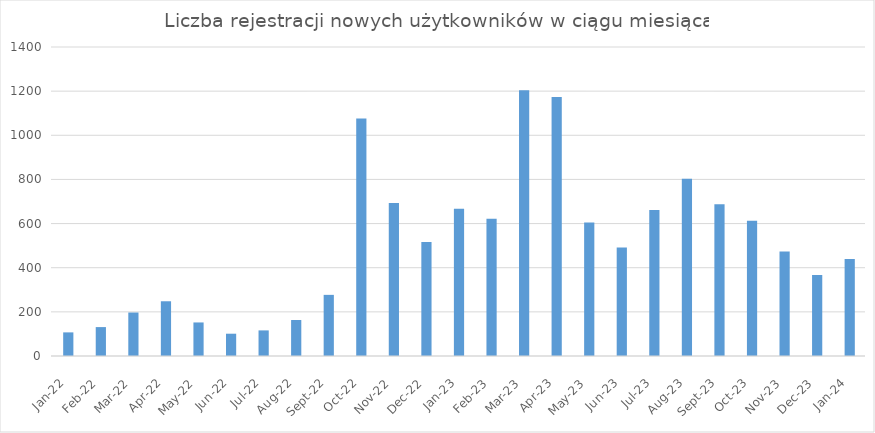
| Category | Series 0 |
|---|---|
| 2022-01-01 | 107 |
| 2022-02-01 | 131 |
| 2022-03-01 | 197 |
| 2022-04-01 | 248 |
| 2022-05-01 | 152 |
| 2022-06-01 | 101 |
| 2022-07-01 | 116 |
| 2022-08-01 | 163 |
| 2022-09-01 | 277 |
| 2022-10-01 | 1076 |
| 2022-11-01 | 693 |
| 2022-12-01 | 517 |
| 2023-01-01 | 667 |
| 2023-02-01 | 622 |
| 2023-03-01 | 1204 |
| 2023-04-01 | 1173 |
| 2023-05-01 | 605 |
| 2023-06-01 | 492 |
| 2023-07-01 | 662 |
| 2023-08-01 | 803 |
| 2023-09-01 | 688 |
| 2023-10-01 | 613 |
| 2023-11-01 | 473 |
| 2023-12-01 | 367 |
| 2024-01-01 | 439 |